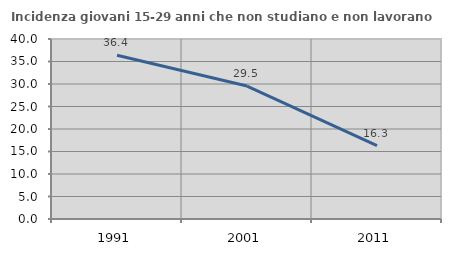
| Category | Incidenza giovani 15-29 anni che non studiano e non lavorano  |
|---|---|
| 1991.0 | 36.371 |
| 2001.0 | 29.545 |
| 2011.0 | 16.327 |